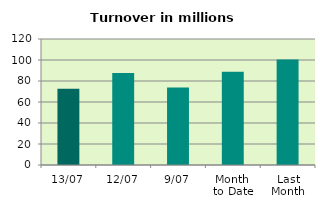
| Category | Series 0 |
|---|---|
| 13/07 | 72.592 |
| 12/07 | 87.689 |
| 9/07 | 73.876 |
| Month 
to Date | 88.87 |
| Last
Month | 100.537 |